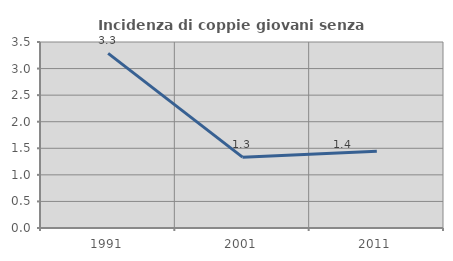
| Category | Incidenza di coppie giovani senza figli |
|---|---|
| 1991.0 | 3.286 |
| 2001.0 | 1.333 |
| 2011.0 | 1.445 |